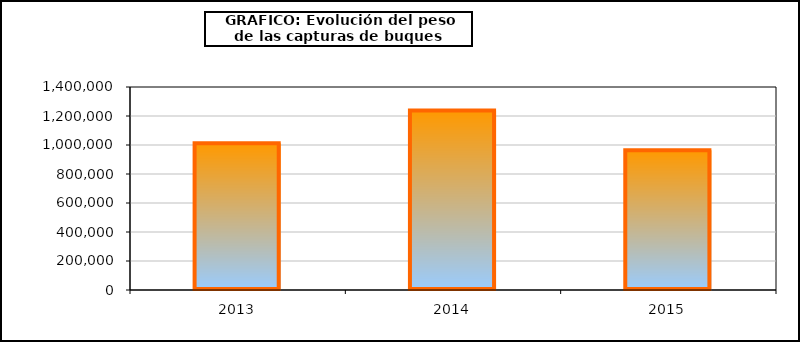
| Category | Series1 |
|---|---|
| 0 | 1012433.853 |
| 1 | 1237306.504 |
| 2 | 964554.316 |